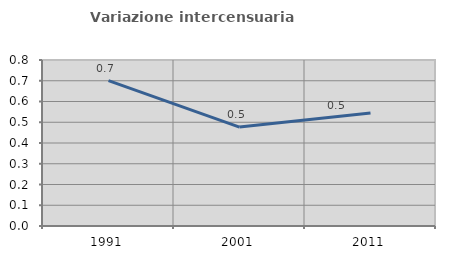
| Category | Variazione intercensuaria annua |
|---|---|
| 1991.0 | 0.701 |
| 2001.0 | 0.477 |
| 2011.0 | 0.545 |